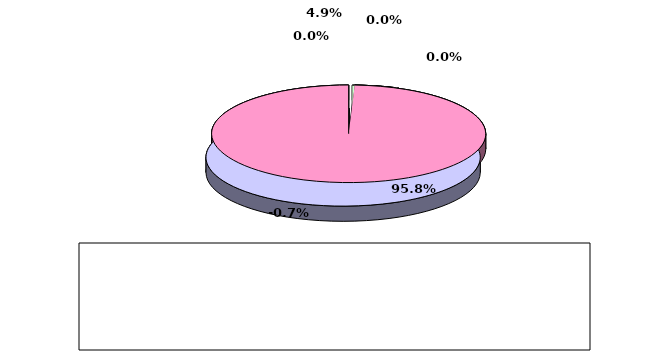
| Category | Series 0 |
|---|---|
| מזומנים ושווי מזומנים | 0.049 |
| אג"ח ממשלתיות סחירות | 0 |
| אג"ח קונצרני סחיר | 0 |
| ני"ע אחרים סחירים | 0.958 |
| פקדונות והלוואות | 0 |
| השקעות אחרות | -0.007 |